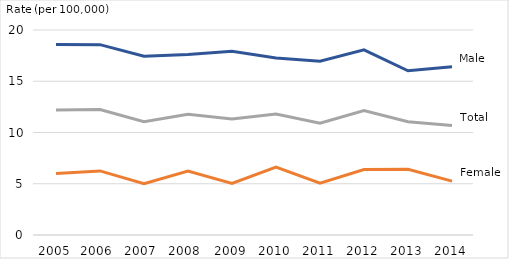
| Category | Male | Female | Total |
|---|---|---|---|
| 2005 | 18.592 | 6.011 | 12.186 |
| 2006  | 18.572 | 6.252 | 12.249 |
| 2007  | 17.446 | 5.006 | 11.044 |
| 2008  | 17.609 | 6.244 | 11.77 |
| 2009 | 17.932 | 5.03 | 11.329 |
| 2010 | 17.273 | 6.634 | 11.807 |
| 2011 | 16.952 | 5.056 | 10.9 |
| 2012 | 18.062 | 6.391 | 12.131 |
| 2013 | 16.024 | 6.412 | 11.044 |
| 2014 | 16.408 | 5.252 | 10.674 |